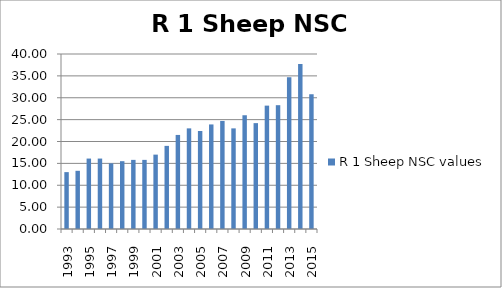
| Category | R 1 Sheep NSC values |
|---|---|
| 1993.0 | 13 |
| 1994.0 | 13.3 |
| 1995.0 | 16.1 |
| 1996.0 | 16.1 |
| 1997.0 | 15 |
| 1998.0 | 15.5 |
| 1999.0 | 15.8 |
| 2000.0 | 15.8 |
| 2001.0 | 17 |
| 2002.0 | 19 |
| 2003.0 | 21.5 |
| 2004.0 | 23 |
| 2005.0 | 22.4 |
| 2006.0 | 23.9 |
| 2007.0 | 24.7 |
| 2008.0 | 23 |
| 2009.0 | 26 |
| 2010.0 | 24.2 |
| 2011.0 | 28.2 |
| 2012.0 | 28.3 |
| 2013.0 | 34.7 |
| 2014.0 | 37.7 |
| 2015.0 | 30.8 |